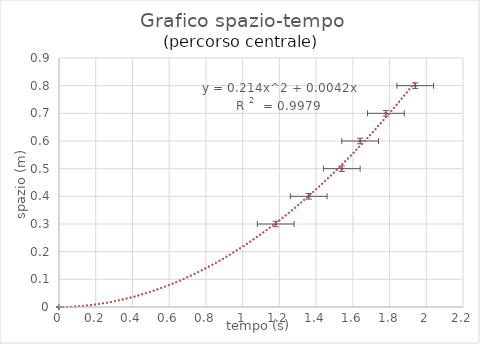
| Category | Series 1 |
|---|---|
| 0.0 | 0 |
| 1.1800000000000002 | 0.3 |
| 1.3599999999999999 | 0.4 |
| 1.54 | 0.5 |
| 1.64 | 0.6 |
| 1.78 | 0.7 |
| 1.94 | 0.8 |